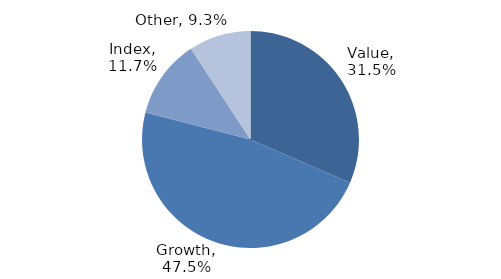
| Category | Investment Style |
|---|---|
| Value | 0.315 |
| Growth | 0.475 |
| Index | 0.117 |
| Other | 0.093 |